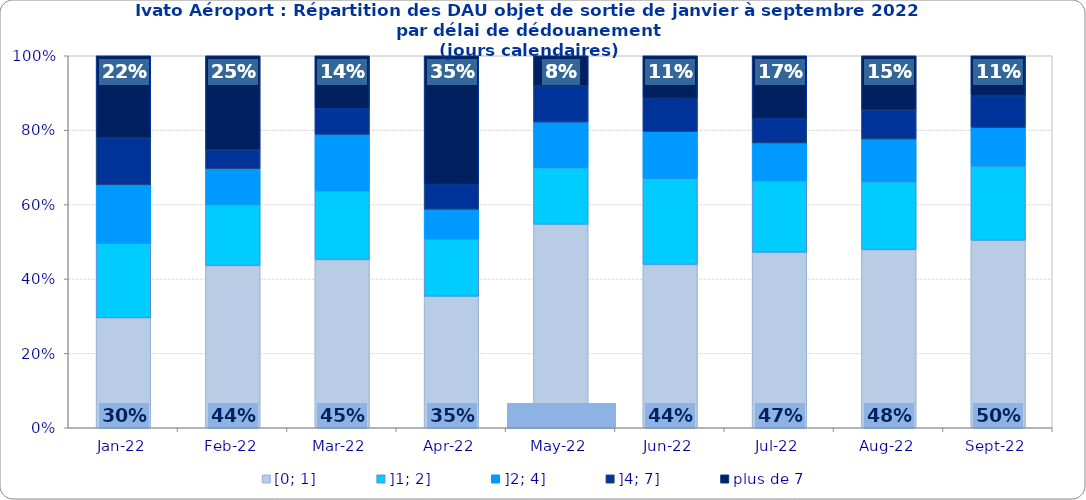
| Category | [0; 1] | ]1; 2] | ]2; 4] | ]4; 7] | plus de 7 |
|---|---|---|---|---|---|
| 2022-01-01 | 0.296 | 0.201 | 0.157 | 0.127 | 0.22 |
| 2022-02-01 | 0.436 | 0.164 | 0.096 | 0.051 | 0.253 |
| 2022-03-01 | 0.452 | 0.185 | 0.151 | 0.069 | 0.143 |
| 2022-04-01 | 0.354 | 0.154 | 0.08 | 0.066 | 0.346 |
| 2022-05-01 | 0.547 | 0.152 | 0.122 | 0.098 | 0.08 |
| 2022-06-01 | 0.439 | 0.232 | 0.125 | 0.09 | 0.114 |
| 2022-07-01 | 0.472 | 0.192 | 0.102 | 0.066 | 0.169 |
| 2022-08-01 | 0.479 | 0.183 | 0.115 | 0.078 | 0.146 |
| 2022-09-01 | 0.504 | 0.199 | 0.104 | 0.086 | 0.107 |